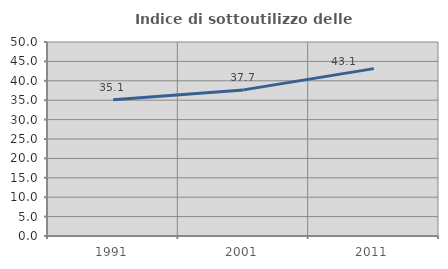
| Category | Indice di sottoutilizzo delle abitazioni  |
|---|---|
| 1991.0 | 35.116 |
| 2001.0 | 37.659 |
| 2011.0 | 43.133 |